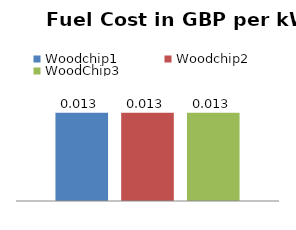
| Category | Woodchip1 | Woodchip2 | WoodChip3 |
|---|---|---|---|
|  | 0.013 | 0.013 | 0.013 |